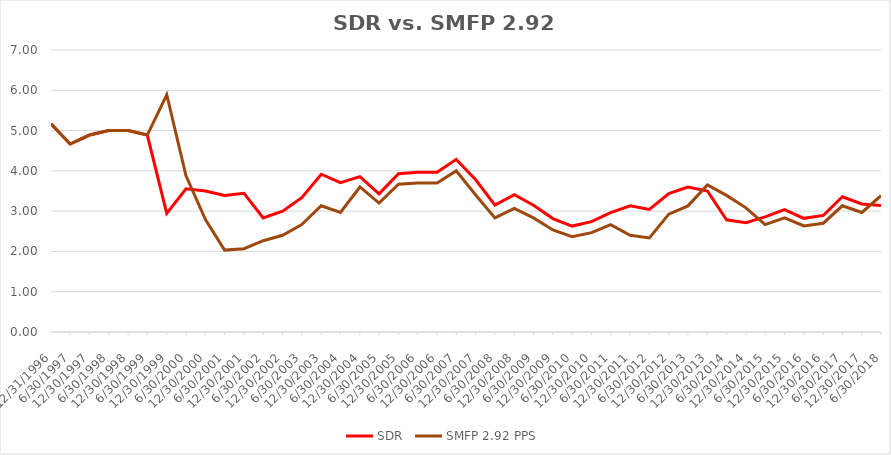
| Category | SDR | SMFP 2.92 PPS |
|---|---|---|
| 12/31/96 | 5.167 | 5.167 |
| 6/30/97 | 4.667 | 4.667 |
| 12/31/97 | 4.889 | 4.889 |
| 6/30/98 | 5 | 5 |
| 12/31/98 | 5 | 5 |
| 6/30/99 | 4.889 | 4.889 |
| 12/31/99 | 2.944 | 5.889 |
| 6/30/00 | 3.556 | 3.876 |
| 12/31/00 | 3.5 | 2.79 |
| 6/30/01 | 3.389 | 2.033 |
| 12/31/01 | 3.444 | 2.067 |
| 6/30/02 | 2.833 | 2.267 |
| 12/31/02 | 3 | 2.4 |
| 6/30/03 | 3.333 | 2.667 |
| 12/31/03 | 3.917 | 3.133 |
| 6/30/04 | 3.708 | 2.967 |
| 12/31/04 | 3.857 | 3.6 |
| 6/30/05 | 3.429 | 3.2 |
| 12/31/05 | 3.929 | 3.667 |
| 6/30/06 | 3.964 | 3.7 |
| 12/31/06 | 3.964 | 3.7 |
| 6/30/07 | 4.286 | 4 |
| 12/31/07 | 3.778 | 3.4 |
| 6/30/08 | 3.148 | 2.833 |
| 12/31/08 | 3.407 | 3.067 |
| 6/30/09 | 3.148 | 2.833 |
| 12/31/09 | 2.815 | 2.533 |
| 6/30/10 | 2.63 | 2.367 |
| 12/31/10 | 2.741 | 2.467 |
| 6/30/11 | 2.963 | 2.667 |
| 12/31/11 | 3.13 | 2.4 |
| 6/30/12 | 3.043 | 2.333 |
| 12/31/12 | 3.435 | 2.926 |
| 6/30/13 | 3.6 | 3.13 |
| 12/31/13 | 3.5 | 3.652 |
| 6/30/14 | 2.786 | 3.391 |
| 12/31/14 | 2.714 | 3.082 |
| 6/30/15 | 2.857 | 2.667 |
| 12/31/15 | 3.036 | 2.833 |
| 6/30/16 | 2.821 | 2.633 |
| 12/31/16 | 2.893 | 2.7 |
| 6/30/17 | 3.357 | 3.133 |
| 12/31/17 | 3.179 | 2.967 |
| 6/30/18 | 3.143 | 3.385 |